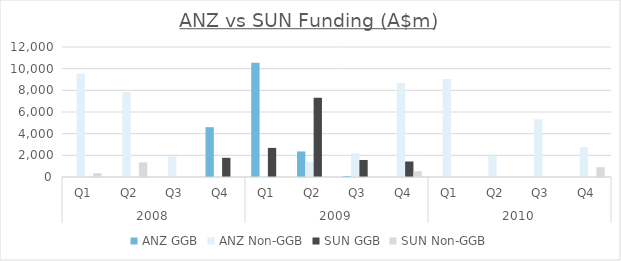
| Category | ANZ | SUN |
|---|---|---|
| 0 | 9557.359 | 356.685 |
| 1 | 7856.526 | 1350 |
| 2 | 1893.491 | 0 |
| 3 | 28.973 | 0 |
| 4 | 82.524 | 0 |
| 5 | 1392.3 | 0 |
| 6 | 2200.742 | 0 |
| 7 | 8668.842 | 530.19 |
| 8 | 9053.678 | 0 |
| 9 | 1925.053 | 0 |
| 10 | 5327.644 | 0 |
| 11 | 2753.893 | 900 |